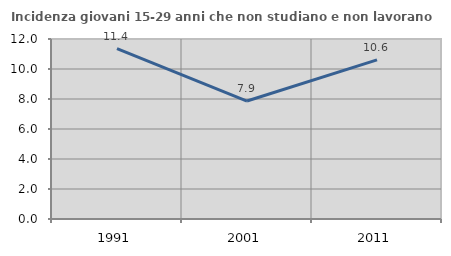
| Category | Incidenza giovani 15-29 anni che non studiano e non lavorano  |
|---|---|
| 1991.0 | 11.351 |
| 2001.0 | 7.865 |
| 2011.0 | 10.606 |